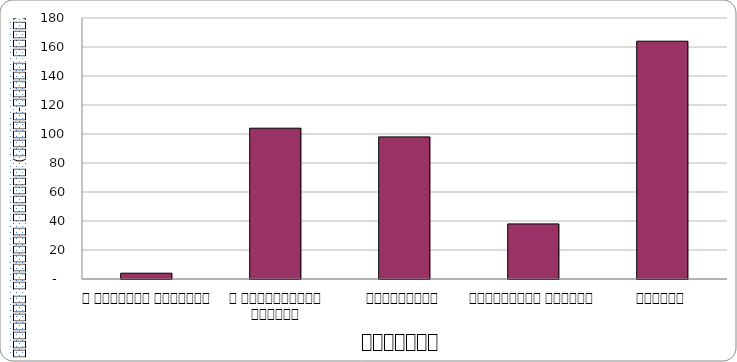
| Category | राजनीति |
|---|---|
| द हिमालयन टाइम्स् | 4 |
| द काठमाण्डौं पोस्ट् | 104 |
| कान्तिपुर | 98 |
| अन्नपूर्ण पोस्ट् | 38 |
| नागरिक | 164 |